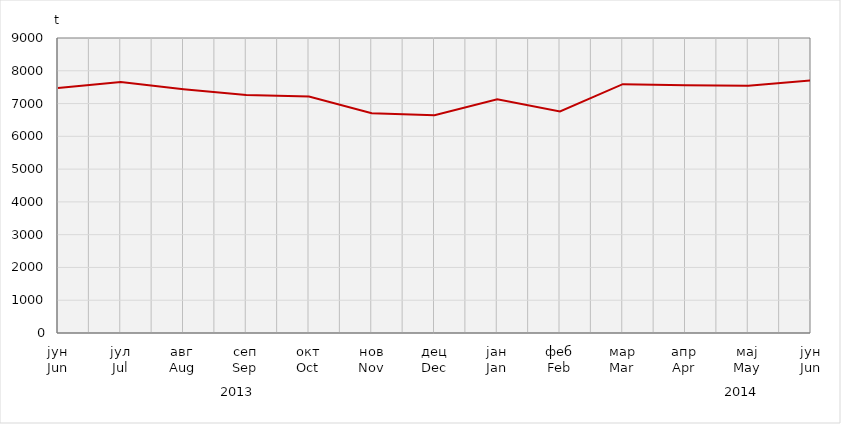
| Category | Series 0 |
|---|---|
| јун
Jun | 7477.208 |
| јул
Jul | 7656.3 |
| авг
Aug | 7438.817 |
| сеп
Sep | 7259.483 |
| окт
Oct | 7215.835 |
| нов
Nov | 6703.771 |
| дец
Dec | 6645.141 |
| јан
Jan | 7129.979 |
| феб
Feb | 6759.17 |
| мар
Mar | 7591.3 |
| апр
Apr | 7558.844 |
| мај
May | 7539.71 |
| јун
Jun | 7705.273 |